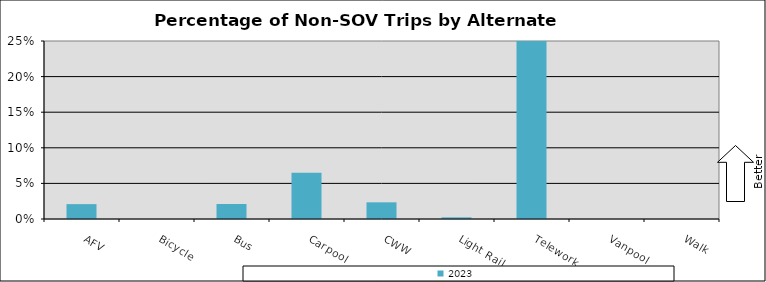
| Category | 2023 |
|---|---|
| AFV | 0.021 |
| Bicycle | 0 |
| Bus | 0.021 |
| Carpool | 0.065 |
| CWW | 0.023 |
| Light Rail | 0.002 |
| Telework | 0.316 |
| Vanpool | 0 |
| Walk | 0 |